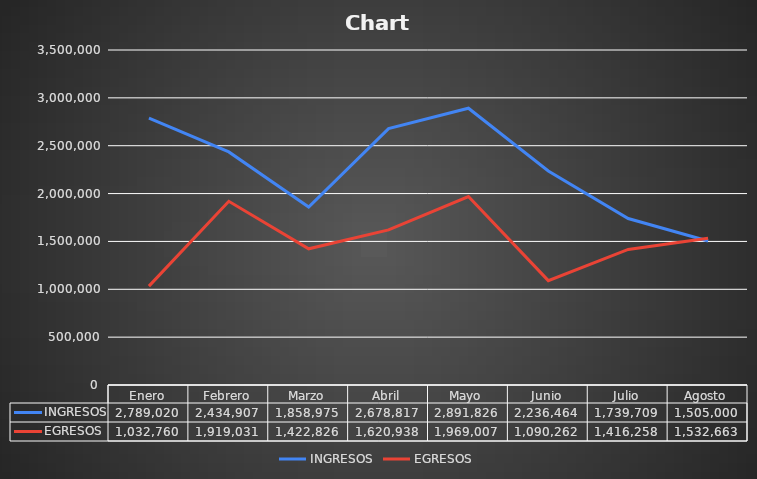
| Category | INGRESOS | EGRESOS |
|---|---|---|
| Enero | 2789020 | 1032760 |
| Febrero | 2434907 | 1919031 |
| Marzo | 1858975 | 1422826 |
| Abril | 2678817 | 1620938 |
| Mayo | 2891826 | 1969007 |
| Junio | 2236464 | 1090262 |
| Julio | 1739709 | 1416258 |
| Agosto | 1505000 | 1532663 |